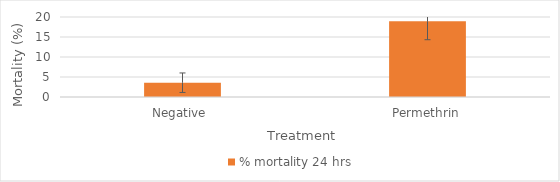
| Category | % mortality 24 hrs |
|---|---|
| Negative  | 3.571 |
| Permethrin | 18.966 |